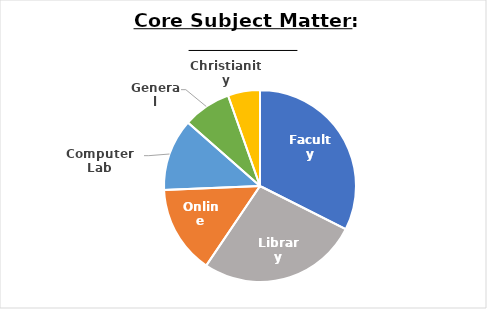
| Category | Count of Core Subject Matter |
|---|---|
| Faculty | 24 |
| Library | 20 |
| Online | 11 |
| Computer Lab | 9 |
| General | 6 |
| Christianity | 4 |